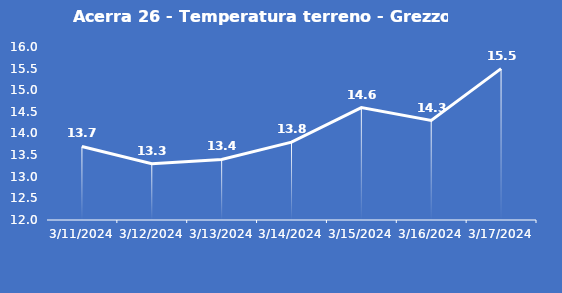
| Category | Acerra 26 - Temperatura terreno - Grezzo (°C) |
|---|---|
| 3/11/24 | 13.7 |
| 3/12/24 | 13.3 |
| 3/13/24 | 13.4 |
| 3/14/24 | 13.8 |
| 3/15/24 | 14.6 |
| 3/16/24 | 14.3 |
| 3/17/24 | 15.5 |